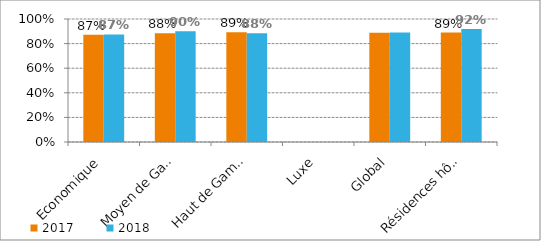
| Category | 2017 | 2018 |
|---|---|---|
| Economique | 0.872 | 0.875 |
| Moyen de Gamme | 0.884 | 0.9 |
| Haut de Gamme | 0.893 | 0.885 |
| Luxe | 0 | 0 |
| Global | 0.888 | 0.891 |
| Résidences hôtelières | 0.89 | 0.92 |